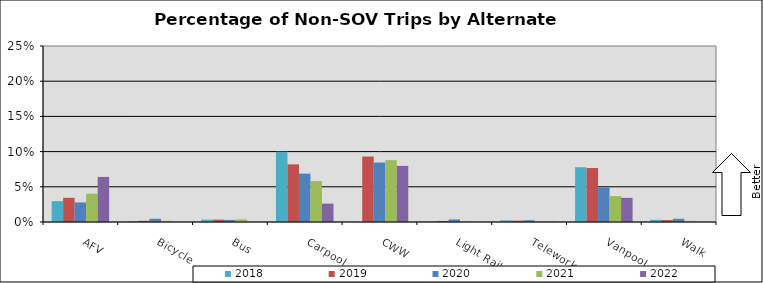
| Category | 2018 | 2019 | 2020 | 2021 | 2022 |
|---|---|---|---|---|---|
| AFV | 0.03 | 0.034 | 0.028 | 0.04 | 0.064 |
| Bicycle | 0.001 | 0.002 | 0.005 | 0.002 | 0 |
| Bus | 0.003 | 0.003 | 0.003 | 0.004 | 0 |
| Carpool | 0.1 | 0.082 | 0.069 | 0.058 | 0.026 |
| CWW | 0 | 0.093 | 0.084 | 0.088 | 0.08 |
| Light Rail | 0.001 | 0.001 | 0.004 | 0.002 | 0 |
| Telework | 0.002 | 0.002 | 0.003 | 0.001 | 0.001 |
| Vanpool | 0.078 | 0.077 | 0.049 | 0.037 | 0.034 |
| Walk | 0.003 | 0.003 | 0.005 | 0.002 | 0 |